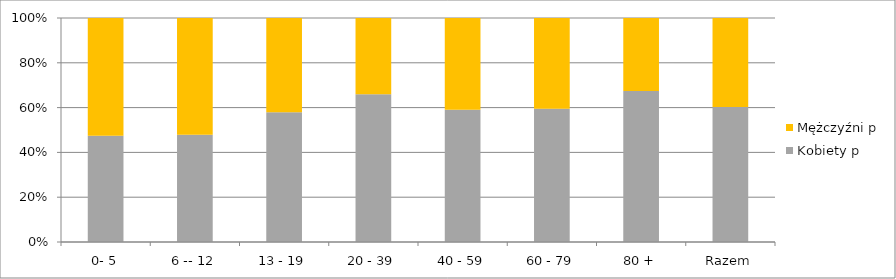
| Category | Kobiety p | Mężczyźni p |
|---|---|---|
| 0- 5 | 0.474 | 0.526 |
| 6 -- 12 | 0.479 | 0.521 |
| 13 - 19 | 0.579 | 0.421 |
| 20 - 39 | 0.659 | 0.341 |
| 40 - 59 | 0.59 | 0.41 |
| 60 - 79 | 0.595 | 0.405 |
| 80 + | 0.674 | 0.326 |
| Razem | 0.602 | 0.398 |